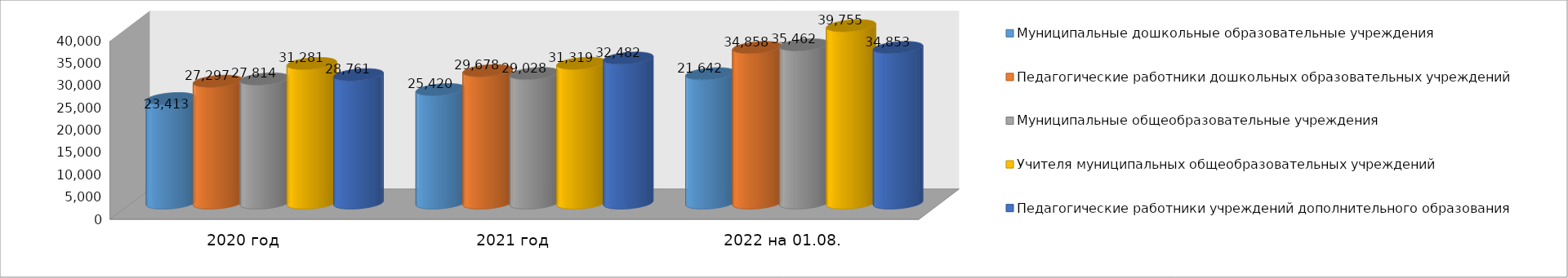
| Category | Муниципальные дошкольные образовательные учреждения | Педагогические работники дошкольных образовательных учреждений | Муниципальные общеобразовательные учреждения | Учителя муниципальных общеобразовательных учреждений | Педагогические работники учреждений дополнительного образования |
|---|---|---|---|---|---|
| 2020 год | 23413 | 27297 | 27814 | 31281 | 28761 |
| 2021 год | 25420 | 29678 | 29028 | 31319 | 32482 |
| 2022 на 01.08. | 28981 | 34858 | 35462 | 39755 | 34853 |